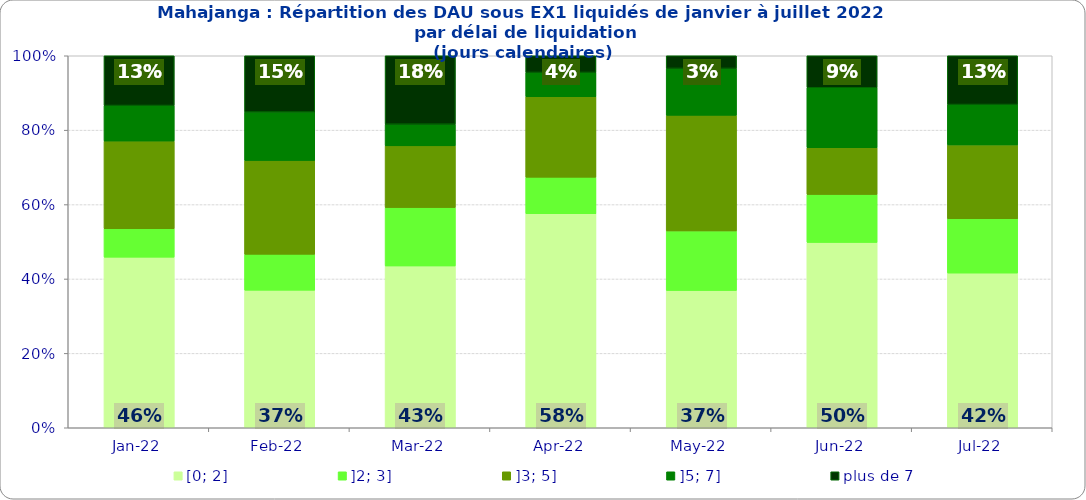
| Category | [0; 2] | ]2; 3] | ]3; 5] | ]5; 7] | plus de 7 |
|---|---|---|---|---|---|
| 2022-01-01 | 0.459 | 0.076 | 0.236 | 0.096 | 0.134 |
| 2022-02-01 | 0.37 | 0.097 | 0.252 | 0.13 | 0.151 |
| 2022-03-01 | 0.435 | 0.157 | 0.166 | 0.058 | 0.184 |
| 2022-04-01 | 0.576 | 0.098 | 0.216 | 0.065 | 0.045 |
| 2022-05-01 | 0.369 | 0.16 | 0.311 | 0.126 | 0.034 |
| 2022-06-01 | 0.498 | 0.129 | 0.125 | 0.161 | 0.086 |
| 2022-07-01 | 0.416 | 0.146 | 0.199 | 0.109 | 0.131 |